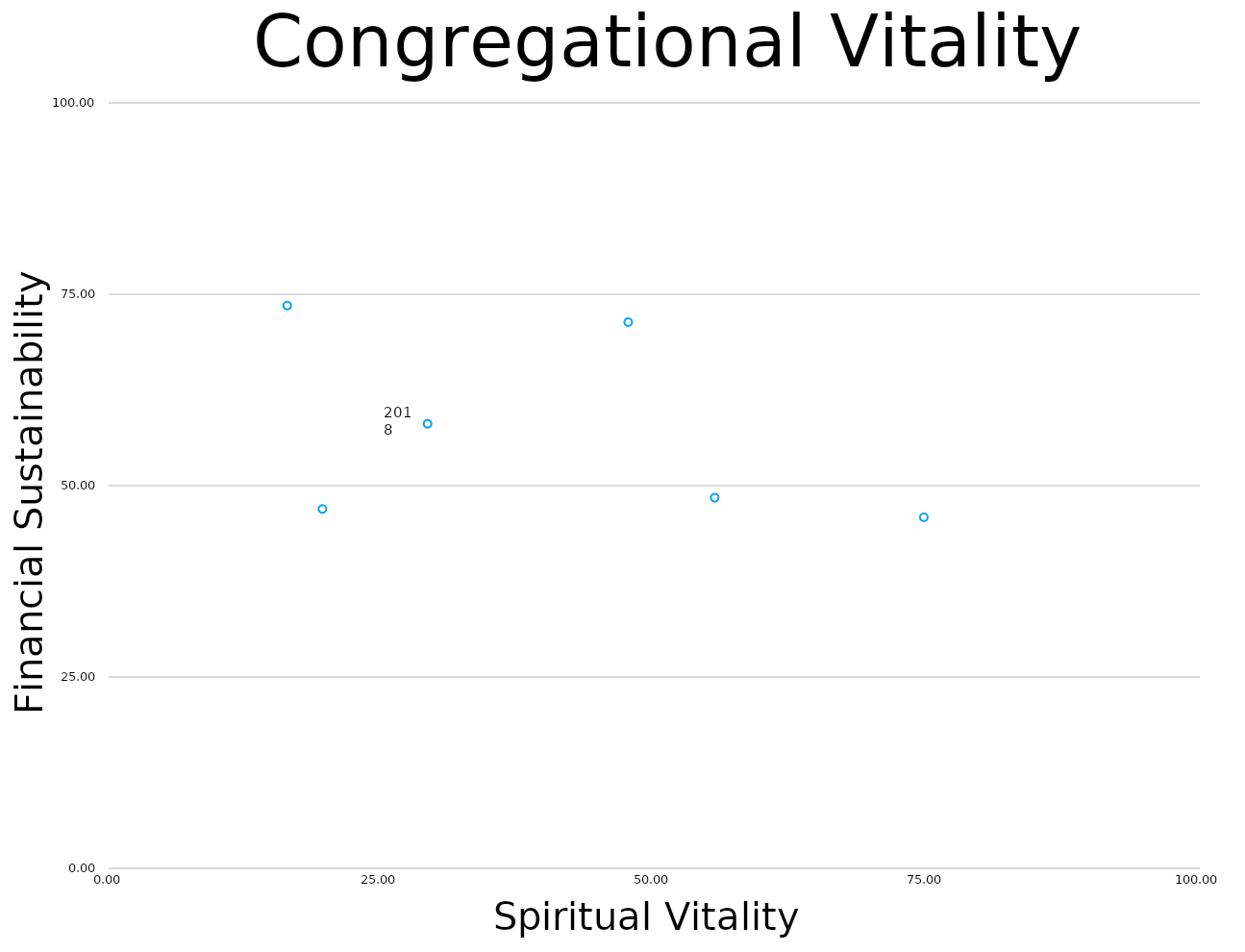
| Category | Overall Spiritual Vitality Factor |
|---|---|
| 16.36813849896786 | 73.52 |
| 55.53957632398753 | 48.427 |
| 74.71088006230529 | 45.864 |
| 0.0 | 0 |
| 0.0 | 0 |
| 0.0 | 0 |
| 0.0 | 0 |
| 0.0 | 0 |
| 0.0 | 0 |
| 47.61395239215316 | 71.357 |
| 29.227828333119355 | 58.078 |
| 19.596311947690843 | 46.942 |
| 0.0 | 0 |
| 0.0 | 0 |
| 0.0 | 0 |
| 0.0 | 0 |
| 0.0 | 0 |